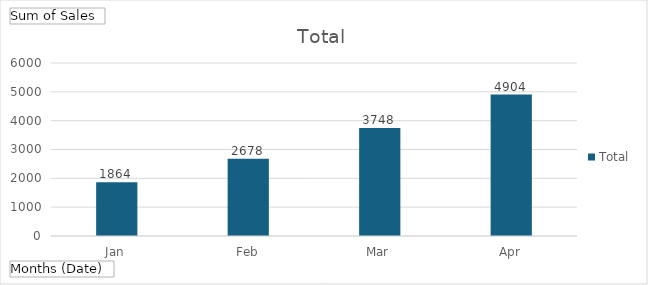
| Category | Total |
|---|---|
| Jan | 1864 |
| Feb | 2678 |
| Mar | 3748 |
| Apr | 4904 |